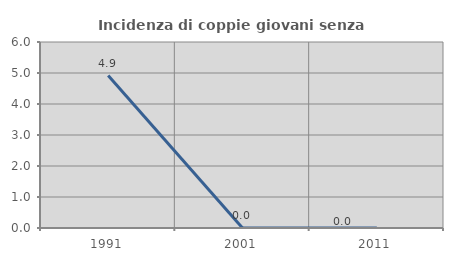
| Category | Incidenza di coppie giovani senza figli |
|---|---|
| 1991.0 | 4.918 |
| 2001.0 | 0 |
| 2011.0 | 0 |